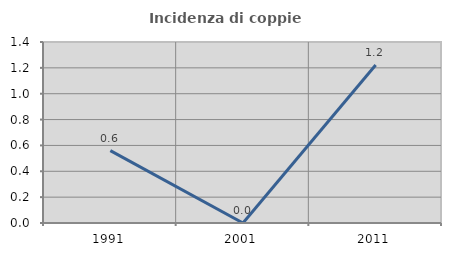
| Category | Incidenza di coppie miste |
|---|---|
| 1991.0 | 0.56 |
| 2001.0 | 0 |
| 2011.0 | 1.222 |